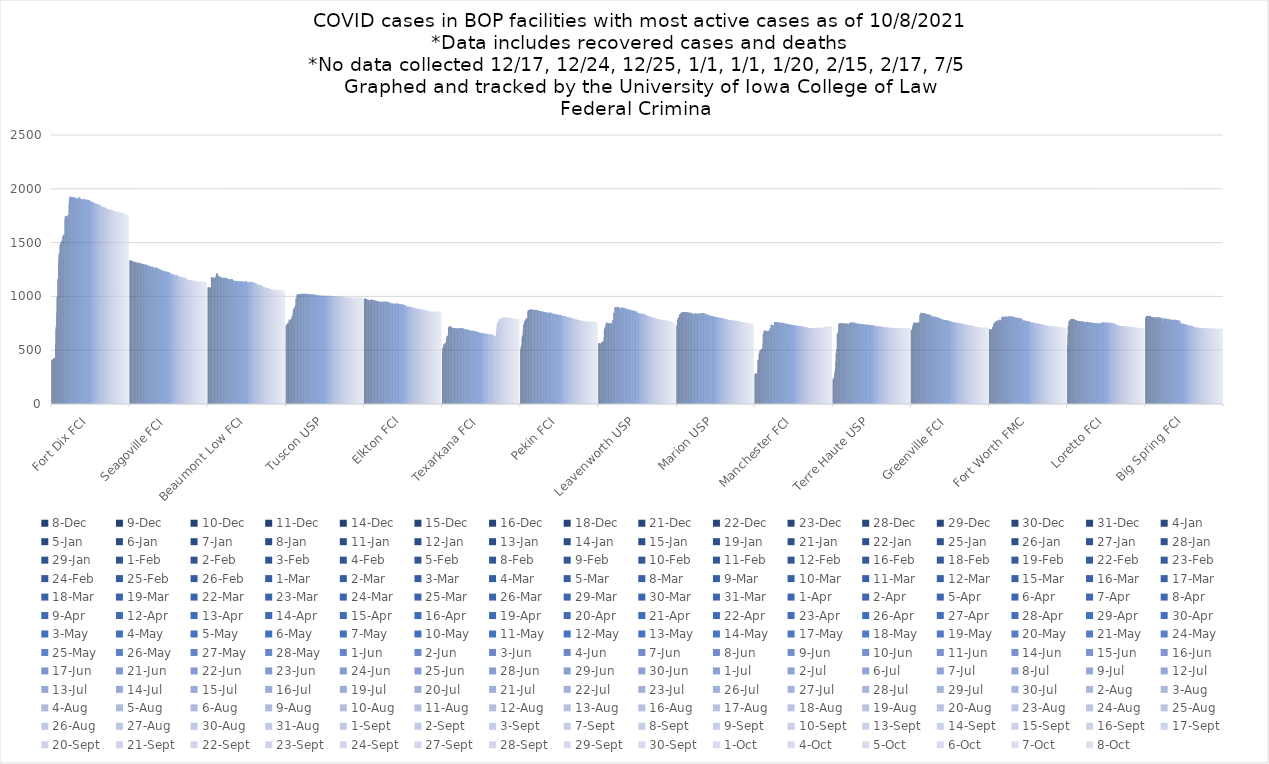
| Category | 8-Dec | 9-Dec | 10-Dec | 11-Dec | 14-Dec | 15-Dec | 16-Dec | 18-Dec | 21-Dec | 22-Dec | 23-Dec | 28-Dec | 29-Dec | 30-Dec | 31-Dec | 4-Jan | 5-Jan | 6-Jan | 7-Jan | 8-Jan | 11-Jan | 12-Jan | 13-Jan | 14-Jan | 15-Jan | 19-Jan | 21-Jan | 22-Jan | 25-Jan | 26-Jan | 27-Jan | 28-Jan | 29-Jan | 1-Feb | 2-Feb | 3-Feb | 4-Feb | 5-Feb | 8-Feb | 9-Feb | 10-Feb | 11-Feb | 12-Feb | 16-Feb | 18-Feb | 19-Feb | 22-Feb | 23-Feb | 24-Feb | 25-Feb | 26-Feb | 1-Mar | 2-Mar | 3-Mar | 4-Mar | 5-Mar | 8-Mar | 9-Mar | 10-Mar | 11-Mar | 12-Mar | 15-Mar | 16-Mar | 17-Mar | 18-Mar | 19-Mar | 22-Mar | 23-Mar | 24-Mar | 25-Mar | 26-Mar | 29-Mar | 30-Mar | 31-Mar | 1-Apr | 2-Apr | 5-Apr | 6-Apr | 7-Apr | 8-Apr | 9-Apr | 12-Apr | 13-Apr | 14-Apr | 15-Apr | 16-Apr | 19-Apr | 20-Apr | 21-Apr | 22-Apr | 23-Apr | 26-Apr | 27-Apr | 28-Apr | 29-Apr | 30-Apr | 3-May | 4-May | 5-May | 6-May | 7-May | 10-May | 11-May | 12-May | 13-May | 14-May | 17-May | 18-May | 19-May | 20-May | 21-May | 24-May | 25-May | 26-May | 27-May | 28-May | 1-Jun | 2-Jun | 3-Jun | 4-Jun | 7-Jun | 8-Jun | 9-Jun | 10-Jun | 11-Jun | 14-Jun | 15-Jun | 16-Jun | 17-Jun | 21-Jun | 22-Jun | 23-Jun | 24-Jun | 25-Jun | 28-Jun | 29-Jun | 30-Jun | 1-Jul | 2-Jul | 6-Jul | 7-Jul | 8-Jul | 9-Jul | 12-Jul | 13-Jul | 14-Jul | 15-Jul | 16-Jul | 19-Jul | 20-Jul | 21-Jul | 22-Jul | 23-Jul | 26-Jul | 27-Jul | 28-Jul | 29-Jul | 30-Jul | 2-Aug | 3-Aug | 4-Aug | 5-Aug | 6-Aug | 9-Aug | 10-Aug | 11-Aug | 12-Aug | 13-Aug | 16-Aug | 17-Aug | 18-Aug | 19-Aug | 20-Aug | 23-Aug | 24-Aug | 25-Aug | 26-Aug | 27-Aug | 30-Aug | 31-Aug | 1-Sep | 2-Sep | 3-Sep | 7-Sep | 8-Sep | 9-Sep | 10-Sep | 13-Sep | 14-Sep | 15-Sep | 16-Sep | 17-Sep | 20-Sep | 21-Sep | 22-Sep | 23-Sep | 24-Sep | 27-Sep | 28-Sep | 29-Sep | 30-Sep | 1-Oct | 4-Oct | 5-Oct | 6-Oct | 7-Oct | 8-Oct |
|---|---|---|---|---|---|---|---|---|---|---|---|---|---|---|---|---|---|---|---|---|---|---|---|---|---|---|---|---|---|---|---|---|---|---|---|---|---|---|---|---|---|---|---|---|---|---|---|---|---|---|---|---|---|---|---|---|---|---|---|---|---|---|---|---|---|---|---|---|---|---|---|---|---|---|---|---|---|---|---|---|---|---|---|---|---|---|---|---|---|---|---|---|---|---|---|---|---|---|---|---|---|---|---|---|---|---|---|---|---|---|---|---|---|---|---|---|---|---|---|---|---|---|---|---|---|---|---|---|---|---|---|---|---|---|---|---|---|---|---|---|---|---|---|---|---|---|---|---|---|---|---|---|---|---|---|---|---|---|---|---|---|---|---|---|---|---|---|---|---|---|---|---|---|---|---|---|---|---|---|---|---|---|---|---|---|---|---|---|---|---|---|---|---|---|---|---|---|---|---|---|---|---|---|---|---|---|---|
| Fort Dix FCI | 411 | 412 | 412 | 415 | 421 | 423 | 423 | 424 | 427 | 430 | 556 | 700 | 723 | 847 | 991 | 997 | 1158 | 1163 | 1316 | 1387 | 1401 | 1406 | 1478 | 1487 | 1497 | 1502 | 1515 | 1512 | 1527 | 1556 | 1556 | 1574 | 1573 | 1573 | 1574 | 1718 | 1751 | 1748 | 1748 | 1747 | 1746 | 1743 | 1743 | 1751 | 1760 | 1758 | 1865 | 1902 | 1925 | 1923 | 1927 | 1927 | 1928 | 1926 | 1921 | 1918 | 1924 | 1925 | 1920 | 1915 | 1923 | 1923 | 1922 | 1922 | 1917 | 1913 | 1913 | 1913 | 1913 | 1913 | 1909 | 1910 | 1923 | 1921 | 1921 | 1918 | 1917 | 1915 | 1910 | 1906 | 1906 | 1904 | 1904 | 1904 | 1904 | 1907 | 1905 | 1905 | 1903 | 1903 | 1901 | 1901 | 1900 | 1900 | 1900 | 1899 | 1897 | 1898 | 1897 | 1897 | 1895 | 1893 | 1892 | 1890 | 1890 | 1884 | 1883 | 1881 | 1878 | 1878 | 1876 | 1876 | 1875 | 1872 | 1871 | 1870 | 1869 | 1863 | 1862 | 1862 | 1860 | 1860 | 1859 | 1859 | 1857 | 1857 | 1855 | 1854 | 1853 | 1850 | 1850 | 1838 | 1837 | 1834 | 1834 | 1833 | 1833 | 1833 | 1833 | 1833 | 1827 | 1826 | 1827 | 1827 | 1826 | 1819 | 1816 | 1814 | 1814 | 1812 | 1812 | 1811 | 1810 | 1809 | 1809 | 1808 | 1807 | 1807 | 1807 | 1805 | 1803 | 1803 | 1802 | 1801 | 1800 | 1796 | 1795 | 1795 | 1794 | 1792 | 1789 | 1786 | 1786 | 1785 | 1788 | 1786 | 1786 | 1785 | 1786 | 1786 | 1784 | 1784 | 1782 | 1780 | 1779 | 1779 | 1779 | 1779 | 1778 | 1775 | 1773 | 1772 | 1772 | 1772 | 1769 | 1767 | 1764 | 1762 | 1762 | 1761 | 1759 | 1758 | 1757 | 1757 | 1756 | 1754 | 1753 |
| Seagoville FCI | 1334 | 1335 | 1334 | 1334 | 1334 | 1333 | 1331 | 1329 | 1327 | 1326 | 1322 | 1324 | 1324 | 1322 | 1321 | 1320 | 1317 | 1316 | 1315 | 1316 | 1316 | 1317 | 1316 | 1315 | 1313 | 1314 | 1308 | 1307 | 1309 | 1309 | 1308 | 1308 | 1306 | 1305 | 1303 | 1302 | 1301 | 1300 | 1298 | 1297 | 1297 | 1296 | 1297 | 1296 | 1297 | 1297 | 1297 | 1290 | 1289 | 1288 | 1288 | 1287 | 1285 | 1282 | 1281 | 1279 | 1277 | 1277 | 1275 | 1276 | 1278 | 1278 | 1278 | 1269 | 1268 | 1267 | 1268 | 1268 | 1268 | 1267 | 1267 | 1268 | 1268 | 1268 | 1264 | 1262 | 1259 | 1258 | 1258 | 1254 | 1254 | 1252 | 1253 | 1249 | 1248 | 1244 | 1243 | 1242 | 1241 | 1238 | 1238 | 1236 | 1235 | 1234 | 1234 | 1234 | 1233 | 1232 | 1232 | 1232 | 1230 | 1230 | 1229 | 1227 | 1227 | 1224 | 1223 | 1221 | 1218 | 1215 | 1213 | 1211 | 1211 | 1210 | 1208 | 1206 | 1206 | 1204 | 1201 | 1201 | 1201 | 1199 | 1197 | 1199 | 1203 | 1202 | 1198 | 1199 | 1196 | 1192 | 1187 | 1186 | 1185 | 1184 | 1185 | 1184 | 1182 | 1180 | 1178 | 1177 | 1175 | 1175 | 1176 | 1177 | 1176 | 1176 | 1176 | 1175 | 1175 | 1174 | 1166 | 1165 | 1162 | 1159 | 1158 | 1156 | 1155 | 1153 | 1152 | 1152 | 1153 | 1153 | 1152 | 1150 | 1151 | 1150 | 1149 | 1149 | 1149 | 1149 | 1147 | 1144 | 1144 | 1145 | 1142 | 1141 | 1141 | 1141 | 1142 | 1140 | 1138 | 1136 | 1137 | 1136 | 1136 | 1136 | 1137 | 1138 | 1137 | 1137 | 1135 | 1136 | 1138 | 1137 | 1137 | 1134 | 1133 | 1133 | 1134 | 1136 | 1136 | 1135 | 1134 | 1134 | 1134 | 1130 | 1130 |
| Beaumont Low FCI | 1084 | 1084 | 1084 | 1084 | 1085 | 1085 | 1085 | 1081 | 1083 | 1184 | 1178 | 1178 | 1178 | 1178 | 1176 | 1175 | 1174 | 1175 | 1173 | 1173 | 1172 | 1187 | 1201 | 1215 | 1217 | 1214 | 1211 | 1211 | 1194 | 1194 | 1190 | 1186 | 1183 | 1182 | 1182 | 1182 | 1177 | 1174 | 1173 | 1173 | 1173 | 1173 | 1173 | 1172 | 1174 | 1174 | 1176 | 1175 | 1174 | 1173 | 1169 | 1170 | 1168 | 1163 | 1162 | 1162 | 1162 | 1161 | 1160 | 1157 | 1161 | 1161 | 1161 | 1162 | 1160 | 1160 | 1160 | 1161 | 1153 | 1145 | 1144 | 1142 | 1146 | 1145 | 1145 | 1144 | 1143 | 1142 | 1141 | 1141 | 1140 | 1140 | 1140 | 1141 | 1139 | 1140 | 1140 | 1141 | 1140 | 1140 | 1141 | 1140 | 1140 | 1136 | 1136 | 1139 | 1139 | 1139 | 1137 | 1135 | 1140 | 1140 | 1143 | 1142 | 1142 | 1132 | 1132 | 1132 | 1132 | 1133 | 1133 | 1133 | 1133 | 1133 | 1135 | 1136 | 1136 | 1136 | 1134 | 1133 | 1133 | 1130 | 1129 | 1127 | 1128 | 1128 | 1127 | 1125 | 1123 | 1120 | 1117 | 1115 | 1114 | 1112 | 1112 | 1110 | 1110 | 1108 | 1108 | 1107 | 1107 | 1105 | 1104 | 1104 | 1103 | 1100 | 1091 | 1090 | 1090 | 1087 | 1087 | 1086 | 1086 | 1085 | 1084 | 1083 | 1083 | 1079 | 1079 | 1079 | 1078 | 1077 | 1077 | 1076 | 1073 | 1070 | 1070 | 1069 | 1069 | 1069 | 1068 | 1066 | 1065 | 1065 | 1065 | 1065 | 1060 | 1059 | 1062 | 1062 | 1063 | 1064 | 1062 | 1062 | 1060 | 1060 | 1059 | 1059 | 1057 | 1059 | 1059 | 1059 | 1059 | 1057 | 1057 | 1056 | 1056 | 1059 | 1059 | 1054 | 1054 | 1053 | 1053 | 1053 | 1053 | 1053 | 1054 |
| Tuscon USP | 729 | 733 | 738 | 741 | 750 | 752 | 752 | 756 | 787 | 787 | 779 | 779 | 784 | 787 | 789 | 798 | 819 | 819 | 833 | 869 | 887 | 889 | 891 | 895 | 908 | 913 | 981 | 990 | 990 | 1017 | 1019 | 1018 | 1019 | 1023 | 1023 | 1023 | 1022 | 1022 | 1022 | 1023 | 1024 | 1024 | 1024 | 1025 | 1025 | 1025 | 1025 | 1025 | 1025 | 1025 | 1024 | 1024 | 1023 | 1024 | 1024 | 1024 | 1024 | 1023 | 1023 | 1022 | 1023 | 1022 | 1022 | 1020 | 1021 | 1020 | 1019 | 1019 | 1020 | 1020 | 1020 | 1019 | 1019 | 1019 | 1018 | 1016 | 1016 | 1017 | 1016 | 1016 | 1016 | 1015 | 1014 | 1013 | 1011 | 1011 | 1009 | 1010 | 1010 | 1010 | 1010 | 1009 | 1009 | 1009 | 1009 | 1009 | 1007 | 1007 | 1007 | 1005 | 1005 | 1005 | 1006 | 1006 | 1006 | 1006 | 1006 | 1006 | 1006 | 1006 | 1007 | 1007 | 1007 | 1007 | 1007 | 1007 | 1006 | 1006 | 1006 | 1006 | 1005 | 1004 | 1004 | 1003 | 1004 | 1004 | 1003 | 1003 | 1004 | 1004 | 1003 | 1003 | 1001 | 1001 | 1002 | 1002 | 1000 | 999 | 999 | 999 | 1000 | 1000 | 1000 | 999 | 999 | 999 | 999 | 998 | 998 | 998 | 998 | 996 | 996 | 996 | 994 | 992 | 992 | 992 | 989 | 991 | 990 | 992 | 992 | 993 | 993 | 991 | 991 | 992 | 991 | 991 | 990 | 989 | 988 | 988 | 989 | 987 | 986 | 987 | 987 | 988 | 988 | 987 | 987 | 987 | 987 | 987 | 987 | 988 | 988 | 989 | 989 | 988 | 988 | 988 | 988 | 989 | 987 | 987 | 987 | 988 | 989 | 990 | 989 | 988 | 989 | 989 | 988 |
| Elkton FCI | 978 | 978 | 978 | 980 | 981 | 981 | 979 | 975 | 973 | 971 | 970 | 970 | 969 | 966 | 966 | 966 | 966 | 966 | 966 | 969 | 971 | 973 | 973 | 967 | 965 | 966 | 964 | 965 | 965 | 965 | 963 | 961 | 959 | 959 | 959 | 957 | 955 | 955 | 953 | 953 | 953 | 952 | 951 | 951 | 951 | 951 | 951 | 951 | 951 | 950 | 948 | 950 | 951 | 951 | 953 | 953 | 953 | 953 | 951 | 951 | 952 | 952 | 950 | 948 | 948 | 948 | 948 | 947 | 943 | 939 | 938 | 937 | 936 | 934 | 936 | 934 | 933 | 933 | 932 | 933 | 933 | 932 | 934 | 934 | 934 | 934 | 934 | 935 | 934 | 933 | 933 | 933 | 933 | 932 | 930 | 929 | 928 | 928 | 927 | 926 | 927 | 927 | 926 | 926 | 926 | 923 | 922 | 921 | 920 | 918 | 918 | 918 | 913 | 910 | 907 | 907 | 907 | 906 | 905 | 905 | 904 | 904 | 904 | 903 | 903 | 903 | 901 | 900 | 898 | 898 | 898 | 896 | 896 | 896 | 896 | 894 | 892 | 889 | 887 | 887 | 887 | 887 | 886 | 886 | 886 | 886 | 885 | 885 | 884 | 883 | 881 | 880 | 880 | 879 | 879 | 877 | 877 | 875 | 876 | 875 | 875 | 874 | 873 | 873 | 873 | 874 | 874 | 874 | 874 | 872 | 867 | 865 | 863 | 863 | 861 | 861 | 861 | 860 | 860 | 859 | 859 | 860 | 860 | 860 | 860 | 860 | 860 | 860 | 860 | 859 | 859 | 859 | 858 | 860 | 860 | 860 | 860 | 860 | 860 | 858 | 857 | 855 | 855 | 856 | 855 | 855 | 853 |
| Texarkana FCI | 477 | 520 | 526 | 541 | 553 | 553 | 553 | 566 | 567 | 567 | 574 | 610 | 629 | 630 | 633 | 639 | 711 | 713 | 717 | 720 | 721 | 722 | 723 | 728 | 718 | 717 | 708 | 707 | 709 | 708 | 708 | 706 | 706 | 705 | 707 | 705 | 703 | 703 | 703 | 707 | 705 | 702 | 703 | 704 | 704 | 704 | 704 | 707 | 708 | 707 | 706 | 705 | 708 | 707 | 704 | 702 | 701 | 701 | 701 | 697 | 696 | 694 | 695 | 695 | 694 | 693 | 693 | 691 | 691 | 691 | 691 | 691 | 688 | 687 | 688 | 685 | 684 | 682 | 681 | 681 | 681 | 682 | 682 | 680 | 678 | 679 | 678 | 678 | 678 | 678 | 677 | 677 | 676 | 670 | 670 | 670 | 670 | 671 | 666 | 664 | 663 | 663 | 663 | 661 | 661 | 658 | 658 | 658 | 658 | 657 | 657 | 655 | 655 | 654 | 655 | 656 | 656 | 656 | 653 | 652 | 651 | 651 | 650 | 650 | 650 | 650 | 650 | 649 | 649 | 648 | 649 | 648 | 648 | 647 | 647 | 647 | 646 | 639 | 636 | 635 | 634 | 633 | 633 | 633 | 665 | 698 | 742 | 742 | 756 | 763 | 771 | 770 | 792 | 792 | 794 | 790 | 790 | 794 | 798 | 804 | 803 | 800 | 802 | 801 | 803 | 803 | 803 | 803 | 805 | 807 | 807 | 806 | 807 | 807 | 807 | 805 | 802 | 801 | 802 | 802 | 801 | 800 | 800 | 800 | 798 | 799 | 799 | 798 | 796 | 794 | 791 | 790 | 791 | 791 | 790 | 790 | 790 | 790 | 790 | 790 | 789 | 789 | 788 | 787 | 786 | 785 | 783 |
| Pekin FCI | 502 | 526 | 536 | 552 | 617 | 635 | 636 | 690 | 739 | 739 | 758 | 771 | 771 | 786 | 786 | 785 | 796 | 800 | 798 | 858 | 868 | 873 | 871 | 872 | 874 | 876 | 879 | 880 | 881 | 879 | 880 | 877 | 878 | 879 | 875 | 874 | 873 | 873 | 873 | 872 | 876 | 876 | 876 | 874 | 873 | 872 | 871 | 871 | 870 | 870 | 867 | 865 | 865 | 864 | 864 | 863 | 861 | 862 | 860 | 859 | 859 | 859 | 857 | 856 | 855 | 855 | 855 | 855 | 852 | 850 | 850 | 851 | 851 | 850 | 849 | 849 | 849 | 849 | 849 | 850 | 850 | 850 | 850 | 846 | 843 | 841 | 841 | 841 | 841 | 838 | 838 | 837 | 838 | 835 | 834 | 834 | 834 | 834 | 831 | 831 | 831 | 829 | 829 | 829 | 829 | 826 | 826 | 826 | 826 | 824 | 824 | 824 | 823 | 821 | 818 | 819 | 819 | 818 | 818 | 817 | 815 | 815 | 813 | 812 | 810 | 810 | 809 | 808 | 807 | 806 | 806 | 806 | 805 | 805 | 804 | 803 | 801 | 798 | 797 | 797 | 796 | 796 | 796 | 795 | 793 | 793 | 788 | 788 | 788 | 787 | 786 | 784 | 784 | 784 | 783 | 781 | 780 | 780 | 780 | 780 | 779 | 774 | 775 | 775 | 775 | 774 | 772 | 771 | 771 | 771 | 770 | 768 | 768 | 768 | 768 | 766 | 767 | 767 | 766 | 767 | 767 | 767 | 766 | 767 | 765 | 765 | 765 | 765 | 766 | 766 | 766 | 766 | 765 | 766 | 764 | 764 | 764 | 764 | 764 | 763 | 761 | 761 | 760 | 761 | 760 | 759 | 760 |
| Leavenworth USP | 568 | 566 | 564 | 564 | 563 | 563 | 563 | 564 | 576 | 577 | 575 | 577 | 584 | 586 | 615 | 685 | 712 | 710 | 709 | 735 | 754 | 754 | 755 | 756 | 756 | 756 | 755 | 751 | 750 | 750 | 751 | 748 | 752 | 751 | 750 | 752 | 752 | 778 | 777 | 781 | 847 | 850 | 846 | 900 | 899 | 901 | 901 | 901 | 900 | 902 | 903 | 901 | 905 | 901 | 900 | 897 | 897 | 895 | 890 | 889 | 891 | 898 | 898 | 898 | 896 | 896 | 894 | 895 | 895 | 893 | 894 | 891 | 890 | 888 | 887 | 884 | 885 | 882 | 880 | 880 | 879 | 879 | 879 | 879 | 876 | 878 | 877 | 873 | 874 | 870 | 872 | 870 | 869 | 869 | 866 | 868 | 868 | 864 | 865 | 862 | 862 | 862 | 859 | 851 | 851 | 849 | 847 | 844 | 844 | 843 | 842 | 842 | 839 | 841 | 841 | 841 | 840 | 838 | 837 | 837 | 838 | 835 | 835 | 835 | 835 | 835 | 835 | 827 | 826 | 822 | 822 | 820 | 816 | 819 | 818 | 818 | 816 | 814 | 814 | 809 | 807 | 806 | 807 | 807 | 806 | 805 | 801 | 802 | 801 | 801 | 796 | 796 | 796 | 795 | 792 | 793 | 793 | 792 | 792 | 791 | 790 | 788 | 787 | 788 | 788 | 785 | 786 | 782 | 784 | 784 | 782 | 781 | 781 | 781 | 780 | 781 | 781 | 781 | 778 | 778 | 778 | 776 | 775 | 776 | 772 | 770 | 771 | 771 | 771 | 769 | 769 | 767 | 768 | 767 | 766 | 765 | 763 | 764 | 764 | 753 | 754 | 754 | 753 | 750 | 752 | 748 | 748 |
| Marion USP | 726 | 736 | 781 | 795 | 799 | 804 | 805 | 827 | 833 | 835 | 836 | 847 | 845 | 850 | 851 | 854 | 855 | 854 | 854 | 854 | 854 | 856 | 856 | 855 | 857 | 858 | 855 | 855 | 855 | 855 | 853 | 850 | 850 | 850 | 850 | 851 | 851 | 848 | 848 | 848 | 846 | 841 | 840 | 839 | 838 | 839 | 839 | 839 | 836 | 838 | 843 | 843 | 843 | 842 | 841 | 841 | 841 | 840 | 839 | 840 | 841 | 841 | 840 | 841 | 843 | 845 | 845 | 845 | 845 | 845 | 845 | 845 | 845 | 844 | 843 | 840 | 840 | 840 | 837 | 835 | 834 | 834 | 834 | 830 | 827 | 828 | 827 | 827 | 823 | 822 | 821 | 820 | 820 | 820 | 818 | 818 | 818 | 818 | 815 | 813 | 812 | 810 | 810 | 810 | 810 | 809 | 809 | 809 | 808 | 807 | 806 | 806 | 806 | 806 | 801 | 801 | 801 | 800 | 802 | 801 | 800 | 800 | 800 | 798 | 796 | 796 | 796 | 794 | 792 | 790 | 790 | 789 | 788 | 788 | 787 | 787 | 786 | 785 | 783 | 782 | 782 | 781 | 781 | 780 | 781 | 781 | 782 | 781 | 779 | 777 | 776 | 775 | 771 | 773 | 773 | 769 | 775 | 776 | 778 | 778 | 775 | 773 | 771 | 771 | 772 | 770 | 770 | 770 | 770 | 770 | 767 | 763 | 763 | 762 | 763 | 761 | 761 | 761 | 760 | 761 | 761 | 761 | 761 | 761 | 759 | 758 | 756 | 756 | 756 | 756 | 754 | 752 | 752 | 752 | 750 | 749 | 748 | 748 | 748 | 745 | 745 | 744 | 743 | 742 | 741 | 740 | 740 |
| Manchester FCI | 276 | 282 | 282 | 283 | 284 | 286 | 287 | 320 | 406 | 410 | 414 | 466 | 467 | 492 | 498 | 498 | 502 | 510 | 511 | 513 | 516 | 566 | 651 | 655 | 679 | 682 | 682 | 682 | 681 | 682 | 684 | 681 | 679 | 681 | 679 | 679 | 681 | 680 | 680 | 680 | 701 | 704 | 706 | 735 | 734 | 736 | 736 | 736 | 735 | 734 | 733 | 733 | 762 | 763 | 763 | 761 | 761 | 762 | 761 | 761 | 762 | 760 | 759 | 761 | 760 | 759 | 758 | 757 | 756 | 755 | 755 | 754 | 754 | 755 | 756 | 756 | 754 | 752 | 752 | 750 | 750 | 749 | 749 | 748 | 746 | 746 | 746 | 746 | 745 | 744 | 743 | 741 | 741 | 741 | 740 | 741 | 738 | 736 | 736 | 734 | 734 | 734 | 734 | 734 | 734 | 733 | 733 | 733 | 733 | 732 | 731 | 730 | 730 | 730 | 727 | 726 | 725 | 725 | 725 | 725 | 724 | 724 | 723 | 723 | 723 | 723 | 723 | 723 | 721 | 721 | 720 | 718 | 718 | 716 | 716 | 716 | 715 | 715 | 713 | 712 | 711 | 710 | 711 | 711 | 710 | 707 | 706 | 706 | 706 | 706 | 706 | 706 | 707 | 705 | 705 | 705 | 704 | 703 | 704 | 706 | 707 | 705 | 705 | 705 | 705 | 706 | 707 | 707 | 708 | 708 | 708 | 708 | 709 | 707 | 708 | 708 | 708 | 707 | 707 | 709 | 709 | 712 | 712 | 712 | 712 | 712 | 715 | 717 | 720 | 721 | 721 | 721 | 721 | 721 | 721 | 721 | 722 | 722 | 722 | 723 | 723 | 723 | 723 | 723 | 721 | 717 | 718 |
| Terre Haute USP | 233 | 235 | 239 | 247 | 277 | 299 | 327 | 396 | 472 | 501 | 507 | 655 | 656 | 658 | 676 | 742 | 748 | 748 | 747 | 752 | 753 | 753 | 751 | 752 | 752 | 750 | 747 | 749 | 749 | 749 | 750 | 749 | 749 | 750 | 747 | 748 | 748 | 748 | 748 | 748 | 748 | 744 | 745 | 746 | 752 | 758 | 758 | 758 | 758 | 759 | 758 | 758 | 758 | 757 | 757 | 757 | 757 | 757 | 757 | 756 | 755 | 751 | 751 | 750 | 749 | 749 | 748 | 748 | 748 | 748 | 746 | 746 | 746 | 744 | 744 | 744 | 744 | 744 | 744 | 744 | 744 | 743 | 743 | 742 | 741 | 740 | 740 | 739 | 738 | 738 | 738 | 738 | 738 | 737 | 737 | 737 | 737 | 736 | 735 | 735 | 735 | 735 | 734 | 733 | 733 | 732 | 731 | 731 | 730 | 731 | 730 | 729 | 727 | 727 | 726 | 726 | 726 | 724 | 722 | 722 | 722 | 722 | 722 | 722 | 722 | 722 | 722 | 720 | 720 | 720 | 720 | 719 | 717 | 717 | 717 | 715 | 714 | 714 | 713 | 713 | 713 | 713 | 713 | 713 | 713 | 711 | 712 | 711 | 711 | 711 | 709 | 709 | 709 | 709 | 709 | 709 | 709 | 709 | 709 | 709 | 708 | 708 | 708 | 708 | 708 | 707 | 707 | 707 | 707 | 707 | 706 | 705 | 705 | 704 | 704 | 704 | 704 | 704 | 704 | 704 | 705 | 705 | 705 | 705 | 705 | 706 | 706 | 706 | 706 | 706 | 706 | 706 | 706 | 706 | 706 | 707 | 708 | 705 | 705 | 704 | 709 | 709 | 711 | 711 | 711 | 711 | 711 |
| Greenville FCI | 689 | 689 | 689 | 695 | 715 | 736 | 739 | 760 | 759 | 758 | 756 | 754 | 756 | 756 | 756 | 755 | 757 | 757 | 756 | 755 | 756 | 759 | 761 | 828 | 829 | 836 | 850 | 850 | 849 | 848 | 846 | 844 | 844 | 845 | 844 | 844 | 844 | 843 | 841 | 841 | 841 | 838 | 836 | 836 | 834 | 833 | 833 | 832 | 833 | 829 | 829 | 829 | 825 | 822 | 822 | 821 | 820 | 818 | 814 | 812 | 812 | 812 | 811 | 811 | 811 | 810 | 810 | 809 | 807 | 807 | 807 | 806 | 805 | 803 | 801 | 800 | 798 | 797 | 794 | 794 | 792 | 791 | 791 | 788 | 787 | 785 | 784 | 784 | 783 | 781 | 781 | 781 | 780 | 780 | 780 | 779 | 778 | 778 | 778 | 776 | 775 | 773 | 772 | 771 | 771 | 770 | 769 | 768 | 765 | 765 | 765 | 763 | 761 | 759 | 759 | 759 | 759 | 759 | 759 | 759 | 756 | 756 | 757 | 756 | 756 | 755 | 754 | 753 | 752 | 753 | 753 | 751 | 750 | 749 | 749 | 748 | 748 | 747 | 745 | 745 | 744 | 743 | 744 | 743 | 739 | 739 | 737 | 737 | 737 | 736 | 736 | 734 | 734 | 734 | 733 | 732 | 731 | 728 | 728 | 729 | 729 | 729 | 730 | 729 | 729 | 726 | 727 | 727 | 727 | 723 | 721 | 719 | 719 | 719 | 719 | 715 | 714 | 715 | 715 | 715 | 714 | 714 | 716 | 715 | 714 | 714 | 712 | 710 | 710 | 711 | 707 | 707 | 709 | 710 | 710 | 710 | 709 | 709 | 709 | 710 | 710 | 710 | 711 | 711 | 709 | 708 | 708 |
| Fort Worth FMC | 694 | 694 | 692 | 695 | 695 | 695 | 693 | 698 | 695 | 717 | 717 | 743 | 746 | 749 | 756 | 760 | 765 | 762 | 767 | 769 | 769 | 775 | 775 | 773 | 774 | 777 | 781 | 782 | 782 | 785 | 780 | 777 | 775 | 802 | 811 | 811 | 810 | 810 | 811 | 811 | 810 | 810 | 810 | 814 | 814 | 814 | 813 | 814 | 813 | 811 | 812 | 816 | 816 | 816 | 816 | 816 | 814 | 814 | 815 | 814 | 814 | 814 | 814 | 814 | 813 | 813 | 810 | 810 | 808 | 805 | 803 | 802 | 803 | 802 | 802 | 803 | 803 | 802 | 800 | 800 | 798 | 798 | 797 | 796 | 797 | 797 | 798 | 799 | 792 | 784 | 778 | 776 | 776 | 776 | 775 | 775 | 775 | 775 | 772 | 772 | 772 | 772 | 772 | 771 | 771 | 769 | 768 | 768 | 765 | 764 | 762 | 760 | 759 | 758 | 757 | 758 | 758 | 757 | 756 | 756 | 755 | 754 | 753 | 751 | 749 | 749 | 748 | 749 | 750 | 749 | 748 | 747 | 747 | 746 | 745 | 744 | 743 | 742 | 741 | 740 | 739 | 738 | 738 | 738 | 738 | 738 | 737 | 737 | 737 | 734 | 732 | 729 | 729 | 728 | 729 | 728 | 729 | 729 | 728 | 728 | 725 | 723 | 722 | 720 | 721 | 721 | 721 | 721 | 721 | 722 | 725 | 725 | 724 | 724 | 724 | 722 | 721 | 722 | 722 | 721 | 721 | 719 | 719 | 719 | 719 | 717 | 716 | 715 | 714 | 712 | 710 | 711 | 711 | 711 | 711 | 710 | 710 | 709 | 709 | 705 | 710 | 707 | 710 | 711 | 709 | 706 | 707 |
| Loretto FCI | 549 | 646 | 724 | 730 | 766 | 775 | 776 | 777 | 787 | 790 | 788 | 793 | 791 | 790 | 790 | 791 | 792 | 790 | 789 | 788 | 788 | 782 | 781 | 779 | 778 | 778 | 774 | 773 | 773 | 774 | 772 | 772 | 772 | 772 | 771 | 771 | 770 | 770 | 770 | 770 | 767 | 770 | 770 | 768 | 765 | 764 | 764 | 763 | 758 | 762 | 762 | 761 | 764 | 764 | 764 | 764 | 763 | 762 | 760 | 758 | 759 | 758 | 758 | 757 | 757 | 758 | 757 | 755 | 754 | 754 | 753 | 753 | 752 | 752 | 752 | 753 | 751 | 750 | 750 | 750 | 750 | 751 | 751 | 751 | 751 | 750 | 750 | 751 | 749 | 748 | 747 | 758 | 758 | 753 | 759 | 759 | 759 | 759 | 759 | 758 | 758 | 757 | 757 | 754 | 754 | 758 | 760 | 758 | 758 | 757 | 757 | 758 | 758 | 755 | 756 | 756 | 756 | 756 | 754 | 753 | 753 | 752 | 751 | 749 | 748 | 747 | 746 | 746 | 745 | 743 | 741 | 738 | 737 | 734 | 734 | 734 | 731 | 729 | 728 | 728 | 726 | 727 | 726 | 726 | 726 | 726 | 726 | 726 | 726 | 725 | 724 | 725 | 725 | 724 | 723 | 723 | 721 | 722 | 720 | 720 | 717 | 719 | 719 | 719 | 719 | 719 | 719 | 720 | 720 | 720 | 719 | 719 | 717 | 717 | 717 | 716 | 716 | 715 | 714 | 713 | 712 | 712 | 711 | 710 | 710 | 709 | 709 | 709 | 709 | 709 | 709 | 709 | 709 | 708 | 708 | 707 | 707 | 707 | 707 | 704 | 705 | 707 | 707 | 707 | 706 | 706 | 705 |
| Big Spring FCI | 803 | 804 | 815 | 815 | 820 | 820 | 820 | 819 | 819 | 820 | 820 | 818 | 818 | 818 | 814 | 814 | 811 | 808 | 807 | 810 | 810 | 809 | 807 | 805 | 804 | 804 | 804 | 805 | 807 | 809 | 809 | 807 | 804 | 807 | 806 | 806 | 807 | 807 | 807 | 804 | 803 | 800 | 800 | 797 | 801 | 765 | 801 | 800 | 798 | 795 | 795 | 795 | 795 | 794 | 793 | 793 | 793 | 793 | 792 | 792 | 791 | 791 | 790 | 789 | 788 | 786 | 786 | 785 | 785 | 783 | 783 | 783 | 783 | 783 | 782 | 783 | 783 | 782 | 782 | 782 | 782 | 782 | 781 | 780 | 779 | 779 | 778 | 778 | 778 | 775 | 775 | 774 | 774 | 774 | 749 | 749 | 749 | 749 | 749 | 749 | 749 | 748 | 746 | 743 | 743 | 742 | 741 | 741 | 739 | 737 | 739 | 738 | 733 | 732 | 732 | 730 | 730 | 730 | 729 | 729 | 729 | 728 | 728 | 727 | 727 | 727 | 727 | 725 | 719 | 719 | 717 | 716 | 714 | 714 | 712 | 712 | 712 | 711 | 711 | 711 | 711 | 709 | 709 | 709 | 709 | 708 | 707 | 707 | 707 | 707 | 707 | 706 | 706 | 706 | 706 | 700 | 707 | 707 | 707 | 707 | 704 | 704 | 704 | 705 | 705 | 698 | 704 | 704 | 704 | 704 | 704 | 702 | 701 | 701 | 701 | 702 | 701 | 701 | 703 | 703 | 703 | 704 | 704 | 704 | 703 | 703 | 702 | 701 | 701 | 700 | 699 | 700 | 699 | 699 | 698 | 699 | 699 | 700 | 700 | 702 | 704 | 701 | 703 | 703 | 703 | 701 | 702 |